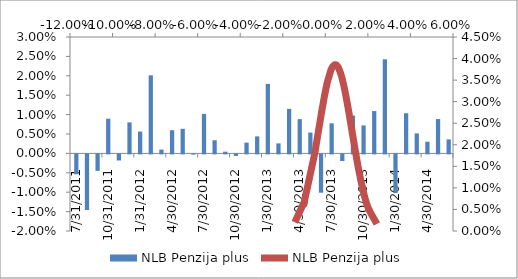
| Category | NLB Penzija plus |
|---|---|
| 31/07/2011 | -0.005 |
| 31/08/2011 | -0.014 |
| 30/09/2011 | -0.004 |
| 31/10/2011 | 0.009 |
| 30/11/2011 | -0.002 |
| 31/12/2011 | 0.008 |
| 31/01/2012 | 0.006 |
| 29/02/2012 | 0.02 |
| 31/03/2012 | 0.001 |
| 30/04/2012 | 0.006 |
| 31/05/2012 | 0.006 |
| 30/06/2012 | 0 |
| 31/07/2012 | 0.01 |
| 31/08/2012 | 0.003 |
| 30/09/2012 | 0 |
| 31/10/2012 | 0 |
| 30/11/2012 | 0.003 |
| 31/12/2012 | 0.004 |
| 31/01/2013 | 0.018 |
| 28/02/2013 | 0.003 |
| 31/03/2013 | 0.011 |
| 30/04/2013 | 0.009 |
| 31/05/2013 | 0.005 |
| 30/06/2013 | -0.01 |
| 31/07/2013 | 0.008 |
| 31/08/2013 | -0.002 |
| 30/09/2013 | 0.01 |
| 31/10/2013 | 0.007 |
| 30/11/2013 | 0.011 |
| 31/12/2013 | 0.024 |
| 31/01/2014 | -0.01 |
| 28/02/2014 | 0.01 |
| 31/03/2014 | 0.005 |
| 30/04/2014 | 0.003 |
| 31/05/2014 | 0.009 |
| 30/06/2014 | 0.004 |